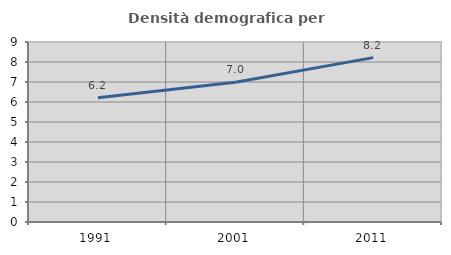
| Category | Densità demografica |
|---|---|
| 1991.0 | 6.21 |
| 2001.0 | 6.991 |
| 2011.0 | 8.218 |